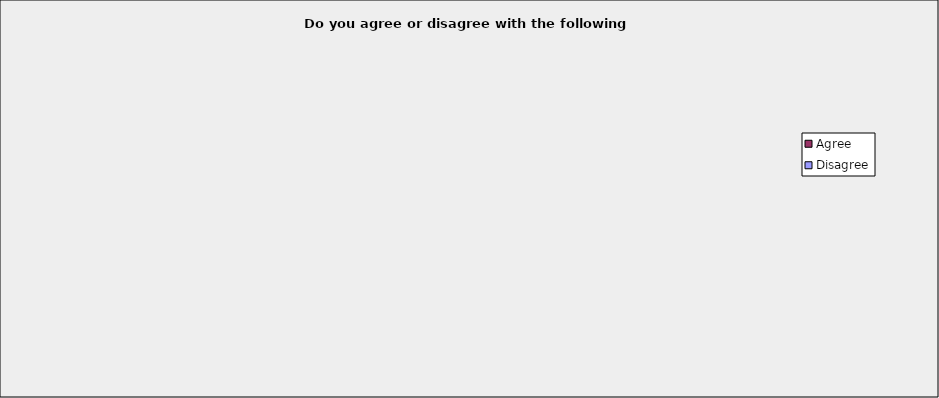
| Category | Disagree | Agree |
|---|---|---|
| 0 | 289 | 848 |
| 1 | 300 | 830 |
| 2 | 425 | 711 |
| 3 | 235 | 911 |
| 4 | 647 | 486 |
| 5 | 736 | 398 |
| 6 | 749 | 380 |
| 7 | 631 | 492 |
| 8 | 261 | 858 |
| 9 | 821 | 297 |
| 10 | 556 | 562 |